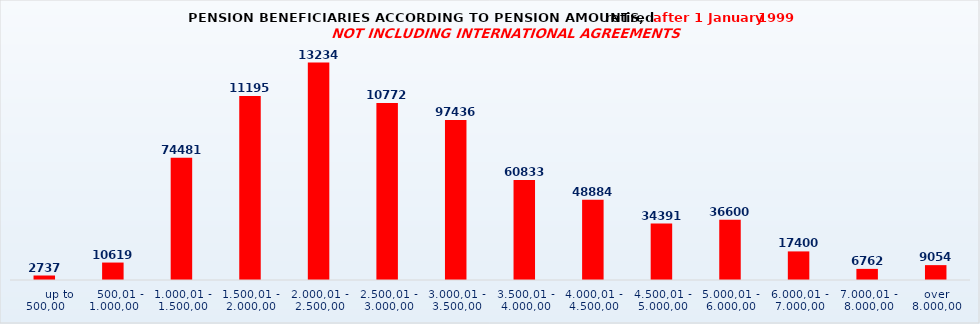
| Category | Series 0 |
|---|---|
|       up to 500,00 | 2737 |
|    500,01 - 1.000,00 | 10619 |
| 1.000,01 - 1.500,00 | 74481 |
| 1.500,01 - 2.000,00 | 111955 |
| 2.000,01 - 2.500,00 | 132342 |
| 2.500,01 - 3.000,00 | 107721 |
| 3.000,01 - 3.500,00 | 97436 |
| 3.500,01 - 4.000,00 | 60833 |
| 4.000,01 - 4.500,00 | 48884 |
| 4.500,01 - 5.000,00 | 34391 |
| 5.000,01 - 6.000,00 | 36600 |
| 6.000,01 - 7.000,00 | 17400 |
| 7.000,01 - 8.000,00 | 6762 |
| over 8.000,00 | 9054 |